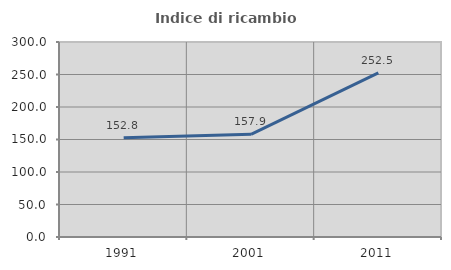
| Category | Indice di ricambio occupazionale  |
|---|---|
| 1991.0 | 152.812 |
| 2001.0 | 157.925 |
| 2011.0 | 252.45 |